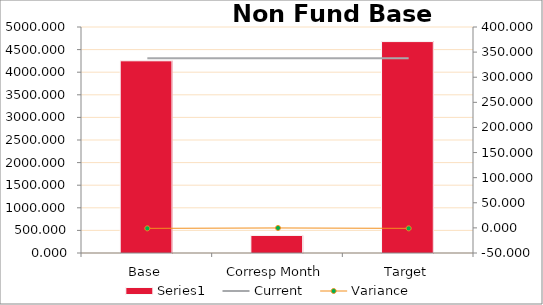
| Category | Series 0 |
|---|---|
| Base | 4252.174 |
| Corresp Month | 389.194 |
| Target | 4677.391 |